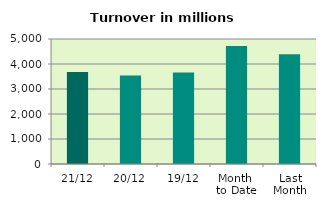
| Category | Series 0 |
|---|---|
| 21/12 | 3681.103 |
| 20/12 | 3538.468 |
| 19/12 | 3662.998 |
| Month 
to Date | 4720.011 |
| Last
Month | 4388.555 |